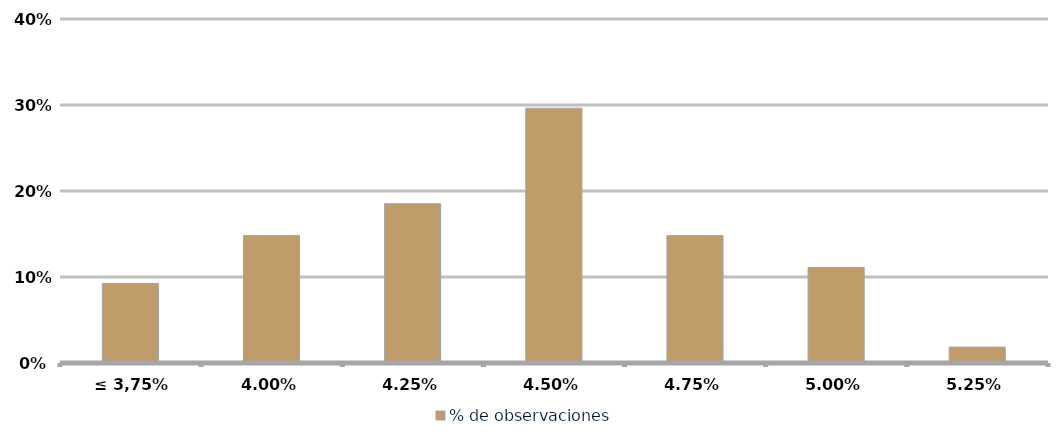
| Category | % de observaciones  |
|---|---|
| ≤ 3,75% | 0.093 |
| 4,00% | 0.148 |
| 4,25% | 0.185 |
| 4,50% | 0.296 |
| 4,75% | 0.148 |
| 5,00% | 0.111 |
| 5,25% | 0.019 |